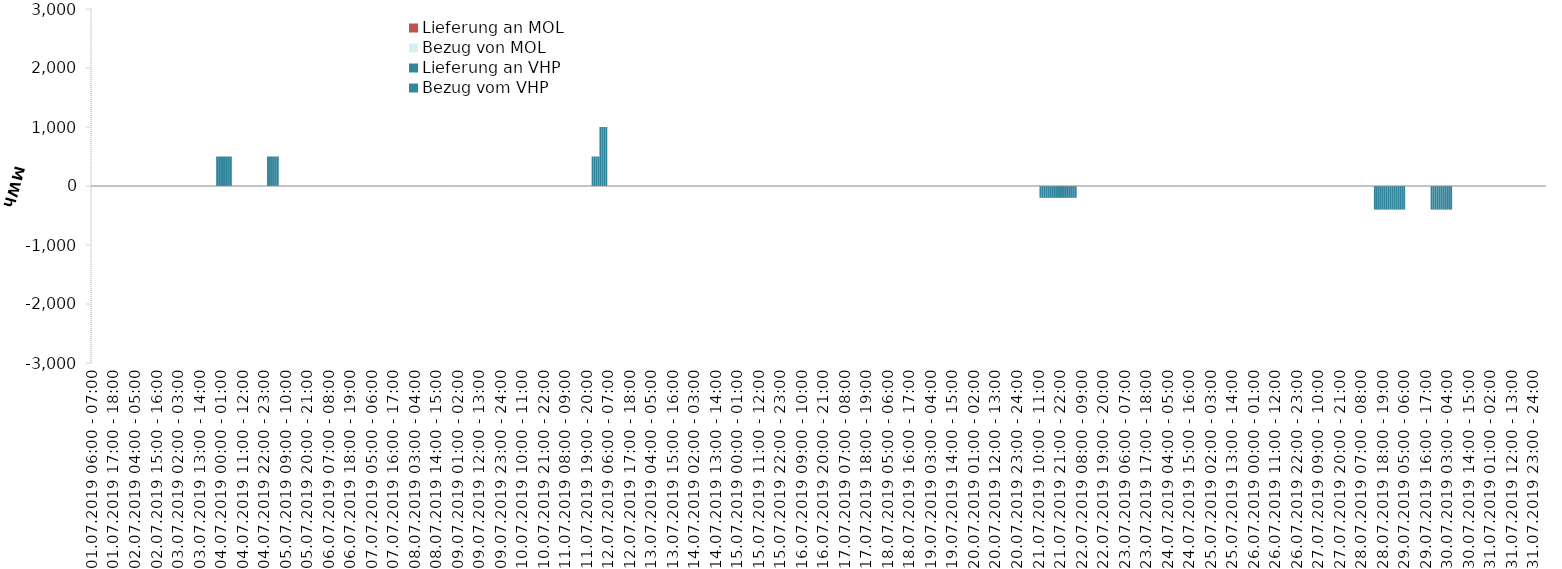
| Category | Bezug vom VHP | Lieferung an VHP | Bezug von MOL | Lieferung an MOL |
|---|---|---|---|---|
| 01.07.2019 06:00 - 07:00 | 0 | 0 | 0 | 0 |
| 01.07.2019 07:00 - 08:00 | 0 | 0 | 0 | 0 |
| 01.07.2019 08:00 - 09:00 | 0 | 0 | 0 | 0 |
| 01.07.2019 09:00 - 10:00 | 0 | 0 | 0 | 0 |
| 01.07.2019 10:00 - 11:00 | 0 | 0 | 0 | 0 |
| 01.07.2019 11:00 - 12:00 | 0 | 0 | 0 | 0 |
| 01.07.2019 12:00 - 13:00 | 0 | 0 | 0 | 0 |
| 01.07.2019 13:00 - 14:00 | 0 | 0 | 0 | 0 |
| 01.07.2019 14:00 - 15:00 | 0 | 0 | 0 | 0 |
| 01.07.2019 15:00 - 16:00 | 0 | 0 | 0 | 0 |
| 01.07.2019 16:00 - 17:00 | 0 | 0 | 0 | 0 |
| 01.07.2019 17:00 - 18:00 | 0 | 0 | 0 | 0 |
| 01.07.2019 18:00 - 19:00 | 0 | 0 | 0 | 0 |
| 01.07.2019 19:00 - 20:00 | 0 | 0 | 0 | 0 |
| 01.07.2019 20:00 - 21:00 | 0 | 0 | 0 | 0 |
| 01.07.2019 21:00 - 22:00 | 0 | 0 | 0 | 0 |
| 01.07.2019 22:00 - 23:00 | 0 | 0 | 0 | 0 |
| 01.07.2019 23:00 - 24:00 | 0 | 0 | 0 | 0 |
| 02.07.2019 00:00 - 01:00 | 0 | 0 | 0 | 0 |
| 02.07.2019 01:00 - 02:00 | 0 | 0 | 0 | 0 |
| 02.07.2019 02:00 - 03:00 | 0 | 0 | 0 | 0 |
| 02.07.2019 03:00 - 04:00 | 0 | 0 | 0 | 0 |
| 02.07.2019 04:00 - 05:00 | 0 | 0 | 0 | 0 |
| 02.07.2019 05:00 - 06:00 | 0 | 0 | 0 | 0 |
| 02.07.2019 06:00 - 07:00 | 0 | 0 | 0 | 0 |
| 02.07.2019 07:00 - 08:00 | 0 | 0 | 0 | 0 |
| 02.07.2019 08:00 - 09:00 | 0 | 0 | 0 | 0 |
| 02.07.2019 09:00 - 10:00 | 0 | 0 | 0 | 0 |
| 02.07.2019 10:00 - 11:00 | 0 | 0 | 0 | 0 |
| 02.07.2019 11:00 - 12:00 | 0 | 0 | 0 | 0 |
| 02.07.2019 12:00 - 13:00 | 0 | 0 | 0 | 0 |
| 02.07.2019 13:00 - 14:00 | 0 | 0 | 0 | 0 |
| 02.07.2019 14:00 - 15:00 | 0 | 0 | 0 | 0 |
| 02.07.2019 15:00 - 16:00 | 0 | 0 | 0 | 0 |
| 02.07.2019 16:00 - 17:00 | 0 | 0 | 0 | 0 |
| 02.07.2019 17:00 - 18:00 | 0 | 0 | 0 | 0 |
| 02.07.2019 18:00 - 19:00 | 0 | 0 | 0 | 0 |
| 02.07.2019 19:00 - 20:00 | 0 | 0 | 0 | 0 |
| 02.07.2019 20:00 - 21:00 | 0 | 0 | 0 | 0 |
| 02.07.2019 21:00 - 22:00 | 0 | 0 | 0 | 0 |
| 02.07.2019 22:00 - 23:00 | 0 | 0 | 0 | 0 |
| 02.07.2019 23:00 - 24:00 | 0 | 0 | 0 | 0 |
| 03.07.2019 00:00 - 01:00 | 0 | 0 | 0 | 0 |
| 03.07.2019 01:00 - 02:00 | 0 | 0 | 0 | 0 |
| 03.07.2019 02:00 - 03:00 | 0 | 0 | 0 | 0 |
| 03.07.2019 03:00 - 04:00 | 0 | 0 | 0 | 0 |
| 03.07.2019 04:00 - 05:00 | 0 | 0 | 0 | 0 |
| 03.07.2019 05:00 - 06:00 | 0 | 0 | 0 | 0 |
| 03.07.2019 06:00 - 07:00 | 0 | 0 | 0 | 0 |
| 03.07.2019 07:00 - 08:00 | 0 | 0 | 0 | 0 |
| 03.07.2019 08:00 - 09:00 | 0 | 0 | 0 | 0 |
| 03.07.2019 09:00 - 10:00 | 0 | 0 | 0 | 0 |
| 03.07.2019 10:00 - 11:00 | 0 | 0 | 0 | 0 |
| 03.07.2019 11:00 - 12:00 | 0 | 0 | 0 | 0 |
| 03.07.2019 12:00 - 13:00 | 0 | 0 | 0 | 0 |
| 03.07.2019 13:00 - 14:00 | 0 | 0 | 0 | 0 |
| 03.07.2019 14:00 - 15:00 | 0 | 0 | 0 | 0 |
| 03.07.2019 15:00 - 16:00 | 0 | 0 | 0 | 0 |
| 03.07.2019 16:00 - 17:00 | 0 | 0 | 0 | 0 |
| 03.07.2019 17:00 - 18:00 | 0 | 0 | 0 | 0 |
| 03.07.2019 18:00 - 19:00 | 0 | 0 | 0 | 0 |
| 03.07.2019 19:00 - 20:00 | 0 | 0 | 0 | 0 |
| 03.07.2019 20:00 - 21:00 | 0 | 0 | 0 | 0 |
| 03.07.2019 21:00 - 22:00 | 0 | 0 | 0 | 0 |
| 03.07.2019 22:00 - 23:00 | 500 | 0 | 0 | 0 |
| 03.07.2019 23:00 - 24:00 | 500 | 0 | 0 | 0 |
| 04.07.2019 00:00 - 01:00 | 500 | 0 | 0 | 0 |
| 04.07.2019 01:00 - 02:00 | 500 | 0 | 0 | 0 |
| 04.07.2019 02:00 - 03:00 | 500 | 0 | 0 | 0 |
| 04.07.2019 03:00 - 04:00 | 500 | 0 | 0 | 0 |
| 04.07.2019 04:00 - 05:00 | 500 | 0 | 0 | 0 |
| 04.07.2019 05:00 - 06:00 | 500 | 0 | 0 | 0 |
| 04.07.2019 06:00 - 07:00 | 0 | 0 | 0 | 0 |
| 04.07.2019 07:00 - 08:00 | 0 | 0 | 0 | 0 |
| 04.07.2019 08:00 - 09:00 | 0 | 0 | 0 | 0 |
| 04.07.2019 09:00 - 10:00 | 0 | 0 | 0 | 0 |
| 04.07.2019 10:00 - 11:00 | 0 | 0 | 0 | 0 |
| 04.07.2019 11:00 - 12:00 | 0 | 0 | 0 | 0 |
| 04.07.2019 12:00 - 13:00 | 0 | 0 | 0 | 0 |
| 04.07.2019 13:00 - 14:00 | 0 | 0 | 0 | 0 |
| 04.07.2019 14:00 - 15:00 | 0 | 0 | 0 | 0 |
| 04.07.2019 15:00 - 16:00 | 0 | 0 | 0 | 0 |
| 04.07.2019 16:00 - 17:00 | 0 | 0 | 0 | 0 |
| 04.07.2019 17:00 - 18:00 | 0 | 0 | 0 | 0 |
| 04.07.2019 18:00 - 19:00 | 0 | 0 | 0 | 0 |
| 04.07.2019 19:00 - 20:00 | 0 | 0 | 0 | 0 |
| 04.07.2019 20:00 - 21:00 | 0 | 0 | 0 | 0 |
| 04.07.2019 21:00 - 22:00 | 0 | 0 | 0 | 0 |
| 04.07.2019 22:00 - 23:00 | 0 | 0 | 0 | 0 |
| 04.07.2019 23:00 - 24:00 | 0 | 0 | 0 | 0 |
| 05.07.2019 00:00 - 01:00 | 500 | 0 | 0 | 0 |
| 05.07.2019 01:00 - 02:00 | 500 | 0 | 0 | 0 |
| 05.07.2019 02:00 - 03:00 | 500 | 0 | 0 | 0 |
| 05.07.2019 03:00 - 04:00 | 500 | 0 | 0 | 0 |
| 05.07.2019 04:00 - 05:00 | 500 | 0 | 0 | 0 |
| 05.07.2019 05:00 - 06:00 | 500 | 0 | 0 | 0 |
| 05.07.2019 06:00 - 07:00 | 0 | 0 | 0 | 0 |
| 05.07.2019 07:00 - 08:00 | 0 | 0 | 0 | 0 |
| 05.07.2019 08:00 - 09:00 | 0 | 0 | 0 | 0 |
| 05.07.2019 09:00 - 10:00 | 0 | 0 | 0 | 0 |
| 05.07.2019 10:00 - 11:00 | 0 | 0 | 0 | 0 |
| 05.07.2019 11:00 - 12:00 | 0 | 0 | 0 | 0 |
| 05.07.2019 12:00 - 13:00 | 0 | 0 | 0 | 0 |
| 05.07.2019 13:00 - 14:00 | 0 | 0 | 0 | 0 |
| 05.07.2019 14:00 - 15:00 | 0 | 0 | 0 | 0 |
| 05.07.2019 15:00 - 16:00 | 0 | 0 | 0 | 0 |
| 05.07.2019 16:00 - 17:00 | 0 | 0 | 0 | 0 |
| 05.07.2019 17:00 - 18:00 | 0 | 0 | 0 | 0 |
| 05.07.2019 18:00 - 19:00 | 0 | 0 | 0 | 0 |
| 05.07.2019 19:00 - 20:00 | 0 | 0 | 0 | 0 |
| 05.07.2019 20:00 - 21:00 | 0 | 0 | 0 | 0 |
| 05.07.2019 21:00 - 22:00 | 0 | 0 | 0 | 0 |
| 05.07.2019 22:00 - 23:00 | 0 | 0 | 0 | 0 |
| 05.07.2019 23:00 - 24:00 | 0 | 0 | 0 | 0 |
| 06.07.2019 00:00 - 01:00 | 0 | 0 | 0 | 0 |
| 06.07.2019 01:00 - 02:00 | 0 | 0 | 0 | 0 |
| 06.07.2019 02:00 - 03:00 | 0 | 0 | 0 | 0 |
| 06.07.2019 03:00 - 04:00 | 0 | 0 | 0 | 0 |
| 06.07.2019 04:00 - 05:00 | 0 | 0 | 0 | 0 |
| 06.07.2019 05:00 - 06:00 | 0 | 0 | 0 | 0 |
| 06.07.2019 06:00 - 07:00 | 0 | 0 | 0 | 0 |
| 06.07.2019 07:00 - 08:00 | 0 | 0 | 0 | 0 |
| 06.07.2019 08:00 - 09:00 | 0 | 0 | 0 | 0 |
| 06.07.2019 09:00 - 10:00 | 0 | 0 | 0 | 0 |
| 06.07.2019 10:00 - 11:00 | 0 | 0 | 0 | 0 |
| 06.07.2019 11:00 - 12:00 | 0 | 0 | 0 | 0 |
| 06.07.2019 12:00 - 13:00 | 0 | 0 | 0 | 0 |
| 06.07.2019 13:00 - 14:00 | 0 | 0 | 0 | 0 |
| 06.07.2019 14:00 - 15:00 | 0 | 0 | 0 | 0 |
| 06.07.2019 15:00 - 16:00 | 0 | 0 | 0 | 0 |
| 06.07.2019 16:00 - 17:00 | 0 | 0 | 0 | 0 |
| 06.07.2019 17:00 - 18:00 | 0 | 0 | 0 | 0 |
| 06.07.2019 18:00 - 19:00 | 0 | 0 | 0 | 0 |
| 06.07.2019 19:00 - 20:00 | 0 | 0 | 0 | 0 |
| 06.07.2019 20:00 - 21:00 | 0 | 0 | 0 | 0 |
| 06.07.2019 21:00 - 22:00 | 0 | 0 | 0 | 0 |
| 06.07.2019 22:00 - 23:00 | 0 | 0 | 0 | 0 |
| 06.07.2019 23:00 - 24:00 | 0 | 0 | 0 | 0 |
| 07.07.2019 00:00 - 01:00 | 0 | 0 | 0 | 0 |
| 07.07.2019 01:00 - 02:00 | 0 | 0 | 0 | 0 |
| 07.07.2019 02:00 - 03:00 | 0 | 0 | 0 | 0 |
| 07.07.2019 03:00 - 04:00 | 0 | 0 | 0 | 0 |
| 07.07.2019 04:00 - 05:00 | 0 | 0 | 0 | 0 |
| 07.07.2019 05:00 - 06:00 | 0 | 0 | 0 | 0 |
| 07.07.2019 06:00 - 07:00 | 0 | 0 | 0 | 0 |
| 07.07.2019 07:00 - 08:00 | 0 | 0 | 0 | 0 |
| 07.07.2019 08:00 - 09:00 | 0 | 0 | 0 | 0 |
| 07.07.2019 09:00 - 10:00 | 0 | 0 | 0 | 0 |
| 07.07.2019 10:00 - 11:00 | 0 | 0 | 0 | 0 |
| 07.07.2019 11:00 - 12:00 | 0 | 0 | 0 | 0 |
| 07.07.2019 12:00 - 13:00 | 0 | 0 | 0 | 0 |
| 07.07.2019 13:00 - 14:00 | 0 | 0 | 0 | 0 |
| 07.07.2019 14:00 - 15:00 | 0 | 0 | 0 | 0 |
| 07.07.2019 15:00 - 16:00 | 0 | 0 | 0 | 0 |
| 07.07.2019 16:00 - 17:00 | 0 | 0 | 0 | 0 |
| 07.07.2019 17:00 - 18:00 | 0 | 0 | 0 | 0 |
| 07.07.2019 18:00 - 19:00 | 0 | 0 | 0 | 0 |
| 07.07.2019 19:00 - 20:00 | 0 | 0 | 0 | 0 |
| 07.07.2019 20:00 - 21:00 | 0 | 0 | 0 | 0 |
| 07.07.2019 21:00 - 22:00 | 0 | 0 | 0 | 0 |
| 07.07.2019 22:00 - 23:00 | 0 | 0 | 0 | 0 |
| 07.07.2019 23:00 - 24:00 | 0 | 0 | 0 | 0 |
| 08.07.2019 00:00 - 01:00 | 0 | 0 | 0 | 0 |
| 08.07.2019 01:00 - 02:00 | 0 | 0 | 0 | 0 |
| 08.07.2019 02:00 - 03:00 | 0 | 0 | 0 | 0 |
| 08.07.2019 03:00 - 04:00 | 0 | 0 | 0 | 0 |
| 08.07.2019 04:00 - 05:00 | 0 | 0 | 0 | 0 |
| 08.07.2019 05:00 - 06:00 | 0 | 0 | 0 | 0 |
| 08.07.2019 06:00 - 07:00 | 0 | 0 | 0 | 0 |
| 08.07.2019 07:00 - 08:00 | 0 | 0 | 0 | 0 |
| 08.07.2019 08:00 - 09:00 | 0 | 0 | 0 | 0 |
| 08.07.2019 09:00 - 10:00 | 0 | 0 | 0 | 0 |
| 08.07.2019 10:00 - 11:00 | 0 | 0 | 0 | 0 |
| 08.07.2019 11:00 - 12:00 | 0 | 0 | 0 | 0 |
| 08.07.2019 12:00 - 13:00 | 0 | 0 | 0 | 0 |
| 08.07.2019 13:00 - 14:00 | 0 | 0 | 0 | 0 |
| 08.07.2019 14:00 - 15:00 | 0 | 0 | 0 | 0 |
| 08.07.2019 15:00 - 16:00 | 0 | 0 | 0 | 0 |
| 08.07.2019 16:00 - 17:00 | 0 | 0 | 0 | 0 |
| 08.07.2019 17:00 - 18:00 | 0 | 0 | 0 | 0 |
| 08.07.2019 18:00 - 19:00 | 0 | 0 | 0 | 0 |
| 08.07.2019 19:00 - 20:00 | 0 | 0 | 0 | 0 |
| 08.07.2019 20:00 - 21:00 | 0 | 0 | 0 | 0 |
| 08.07.2019 21:00 - 22:00 | 0 | 0 | 0 | 0 |
| 08.07.2019 22:00 - 23:00 | 0 | 0 | 0 | 0 |
| 08.07.2019 23:00 - 24:00 | 0 | 0 | 0 | 0 |
| 09.07.2019 00:00 - 01:00 | 0 | 0 | 0 | 0 |
| 09.07.2019 01:00 - 02:00 | 0 | 0 | 0 | 0 |
| 09.07.2019 02:00 - 03:00 | 0 | 0 | 0 | 0 |
| 09.07.2019 03:00 - 04:00 | 0 | 0 | 0 | 0 |
| 09.07.2019 04:00 - 05:00 | 0 | 0 | 0 | 0 |
| 09.07.2019 05:00 - 06:00 | 0 | 0 | 0 | 0 |
| 09.07.2019 06:00 - 07:00 | 0 | 0 | 0 | 0 |
| 09.07.2019 07:00 - 08:00 | 0 | 0 | 0 | 0 |
| 09.07.2019 08:00 - 09:00 | 0 | 0 | 0 | 0 |
| 09.07.2019 09:00 - 10:00 | 0 | 0 | 0 | 0 |
| 09.07.2019 10:00 - 11:00 | 0 | 0 | 0 | 0 |
| 09.07.2019 11:00 - 12:00 | 0 | 0 | 0 | 0 |
| 09.07.2019 12:00 - 13:00 | 0 | 0 | 0 | 0 |
| 09.07.2019 13:00 - 14:00 | 0 | 0 | 0 | 0 |
| 09.07.2019 14:00 - 15:00 | 0 | 0 | 0 | 0 |
| 09.07.2019 15:00 - 16:00 | 0 | 0 | 0 | 0 |
| 09.07.2019 16:00 - 17:00 | 0 | 0 | 0 | 0 |
| 09.07.2019 17:00 - 18:00 | 0 | 0 | 0 | 0 |
| 09.07.2019 18:00 - 19:00 | 0 | 0 | 0 | 0 |
| 09.07.2019 19:00 - 20:00 | 0 | 0 | 0 | 0 |
| 09.07.2019 20:00 - 21:00 | 0 | 0 | 0 | 0 |
| 09.07.2019 21:00 - 22:00 | 0 | 0 | 0 | 0 |
| 09.07.2019 22:00 - 23:00 | 0 | 0 | 0 | 0 |
| 09.07.2019 23:00 - 24:00 | 0 | 0 | 0 | 0 |
| 10.07.2019 00:00 - 01:00 | 0 | 0 | 0 | 0 |
| 10.07.2019 01:00 - 02:00 | 0 | 0 | 0 | 0 |
| 10.07.2019 02:00 - 03:00 | 0 | 0 | 0 | 0 |
| 10.07.2019 03:00 - 04:00 | 0 | 0 | 0 | 0 |
| 10.07.2019 04:00 - 05:00 | 0 | 0 | 0 | 0 |
| 10.07.2019 05:00 - 06:00 | 0 | 0 | 0 | 0 |
| 10.07.2019 06:00 - 07:00 | 0 | 0 | 0 | 0 |
| 10.07.2019 07:00 - 08:00 | 0 | 0 | 0 | 0 |
| 10.07.2019 08:00 - 09:00 | 0 | 0 | 0 | 0 |
| 10.07.2019 09:00 - 10:00 | 0 | 0 | 0 | 0 |
| 10.07.2019 10:00 - 11:00 | 0 | 0 | 0 | 0 |
| 10.07.2019 11:00 - 12:00 | 0 | 0 | 0 | 0 |
| 10.07.2019 12:00 - 13:00 | 0 | 0 | 0 | 0 |
| 10.07.2019 13:00 - 14:00 | 0 | 0 | 0 | 0 |
| 10.07.2019 14:00 - 15:00 | 0 | 0 | 0 | 0 |
| 10.07.2019 15:00 - 16:00 | 0 | 0 | 0 | 0 |
| 10.07.2019 16:00 - 17:00 | 0 | 0 | 0 | 0 |
| 10.07.2019 17:00 - 18:00 | 0 | 0 | 0 | 0 |
| 10.07.2019 18:00 - 19:00 | 0 | 0 | 0 | 0 |
| 10.07.2019 19:00 - 20:00 | 0 | 0 | 0 | 0 |
| 10.07.2019 20:00 - 21:00 | 0 | 0 | 0 | 0 |
| 10.07.2019 21:00 - 22:00 | 0 | 0 | 0 | 0 |
| 10.07.2019 22:00 - 23:00 | 0 | 0 | 0 | 0 |
| 10.07.2019 23:00 - 24:00 | 0 | 0 | 0 | 0 |
| 11.07.2019 00:00 - 01:00 | 0 | 0 | 0 | 0 |
| 11.07.2019 01:00 - 02:00 | 0 | 0 | 0 | 0 |
| 11.07.2019 02:00 - 03:00 | 0 | 0 | 0 | 0 |
| 11.07.2019 03:00 - 04:00 | 0 | 0 | 0 | 0 |
| 11.07.2019 04:00 - 05:00 | 0 | 0 | 0 | 0 |
| 11.07.2019 05:00 - 06:00 | 0 | 0 | 0 | 0 |
| 11.07.2019 06:00 - 07:00 | 0 | 0 | 0 | 0 |
| 11.07.2019 07:00 - 08:00 | 0 | 0 | 0 | 0 |
| 11.07.2019 08:00 - 09:00 | 0 | 0 | 0 | 0 |
| 11.07.2019 09:00 - 10:00 | 0 | 0 | 0 | 0 |
| 11.07.2019 10:00 - 11:00 | 0 | 0 | 0 | 0 |
| 11.07.2019 11:00 - 12:00 | 0 | 0 | 0 | 0 |
| 11.07.2019 12:00 - 13:00 | 0 | 0 | 0 | 0 |
| 11.07.2019 13:00 - 14:00 | 0 | 0 | 0 | 0 |
| 11.07.2019 14:00 - 15:00 | 0 | 0 | 0 | 0 |
| 11.07.2019 15:00 - 16:00 | 0 | 0 | 0 | 0 |
| 11.07.2019 16:00 - 17:00 | 0 | 0 | 0 | 0 |
| 11.07.2019 17:00 - 18:00 | 0 | 0 | 0 | 0 |
| 11.07.2019 18:00 - 19:00 | 0 | 0 | 0 | 0 |
| 11.07.2019 19:00 - 20:00 | 0 | 0 | 0 | 0 |
| 11.07.2019 20:00 - 21:00 | 0 | 0 | 0 | 0 |
| 11.07.2019 21:00 - 22:00 | 0 | 0 | 0 | 0 |
| 11.07.2019 22:00 - 23:00 | 500 | 0 | 0 | 0 |
| 11.07.2019 23:00 - 24:00 | 500 | 0 | 0 | 0 |
| 12.07.2019 00:00 - 01:00 | 500 | 0 | 0 | 0 |
| 12.07.2019 01:00 - 02:00 | 500 | 0 | 0 | 0 |
| 12.07.2019 02:00 - 03:00 | 1000 | 0 | 0 | 0 |
| 12.07.2019 03:00 - 04:00 | 1000 | 0 | 0 | 0 |
| 12.07.2019 04:00 - 05:00 | 1000 | 0 | 0 | 0 |
| 12.07.2019 05:00 - 06:00 | 1000 | 0 | 0 | 0 |
| 12.07.2019 06:00 - 07:00 | 0 | 0 | 0 | 0 |
| 12.07.2019 07:00 - 08:00 | 0 | 0 | 0 | 0 |
| 12.07.2019 08:00 - 09:00 | 0 | 0 | 0 | 0 |
| 12.07.2019 09:00 - 10:00 | 0 | 0 | 0 | 0 |
| 12.07.2019 10:00 - 11:00 | 0 | 0 | 0 | 0 |
| 12.07.2019 11:00 - 12:00 | 0 | 0 | 0 | 0 |
| 12.07.2019 12:00 - 13:00 | 0 | 0 | 0 | 0 |
| 12.07.2019 13:00 - 14:00 | 0 | 0 | 0 | 0 |
| 12.07.2019 14:00 - 15:00 | 0 | 0 | 0 | 0 |
| 12.07.2019 15:00 - 16:00 | 0 | 0 | 0 | 0 |
| 12.07.2019 16:00 - 17:00 | 0 | 0 | 0 | 0 |
| 12.07.2019 17:00 - 18:00 | 0 | 0 | 0 | 0 |
| 12.07.2019 18:00 - 19:00 | 0 | 0 | 0 | 0 |
| 12.07.2019 19:00 - 20:00 | 0 | 0 | 0 | 0 |
| 12.07.2019 20:00 - 21:00 | 0 | 0 | 0 | 0 |
| 12.07.2019 21:00 - 22:00 | 0 | 0 | 0 | 0 |
| 12.07.2019 22:00 - 23:00 | 0 | 0 | 0 | 0 |
| 12.07.2019 23:00 - 24:00 | 0 | 0 | 0 | 0 |
| 13.07.2019 00:00 - 01:00 | 0 | 0 | 0 | 0 |
| 13.07.2019 01:00 - 02:00 | 0 | 0 | 0 | 0 |
| 13.07.2019 02:00 - 03:00 | 0 | 0 | 0 | 0 |
| 13.07.2019 03:00 - 04:00 | 0 | 0 | 0 | 0 |
| 13.07.2019 04:00 - 05:00 | 0 | 0 | 0 | 0 |
| 13.07.2019 05:00 - 06:00 | 0 | 0 | 0 | 0 |
| 13.07.2019 06:00 - 07:00 | 0 | 0 | 0 | 0 |
| 13.07.2019 07:00 - 08:00 | 0 | 0 | 0 | 0 |
| 13.07.2019 08:00 - 09:00 | 0 | 0 | 0 | 0 |
| 13.07.2019 09:00 - 10:00 | 0 | 0 | 0 | 0 |
| 13.07.2019 10:00 - 11:00 | 0 | 0 | 0 | 0 |
| 13.07.2019 11:00 - 12:00 | 0 | 0 | 0 | 0 |
| 13.07.2019 12:00 - 13:00 | 0 | 0 | 0 | 0 |
| 13.07.2019 13:00 - 14:00 | 0 | 0 | 0 | 0 |
| 13.07.2019 14:00 - 15:00 | 0 | 0 | 0 | 0 |
| 13.07.2019 15:00 - 16:00 | 0 | 0 | 0 | 0 |
| 13.07.2019 16:00 - 17:00 | 0 | 0 | 0 | 0 |
| 13.07.2019 17:00 - 18:00 | 0 | 0 | 0 | 0 |
| 13.07.2019 18:00 - 19:00 | 0 | 0 | 0 | 0 |
| 13.07.2019 19:00 - 20:00 | 0 | 0 | 0 | 0 |
| 13.07.2019 20:00 - 21:00 | 0 | 0 | 0 | 0 |
| 13.07.2019 21:00 - 22:00 | 0 | 0 | 0 | 0 |
| 13.07.2019 22:00 - 23:00 | 0 | 0 | 0 | 0 |
| 13.07.2019 23:00 - 24:00 | 0 | 0 | 0 | 0 |
| 14.07.2019 00:00 - 01:00 | 0 | 0 | 0 | 0 |
| 14.07.2019 01:00 - 02:00 | 0 | 0 | 0 | 0 |
| 14.07.2019 02:00 - 03:00 | 0 | 0 | 0 | 0 |
| 14.07.2019 03:00 - 04:00 | 0 | 0 | 0 | 0 |
| 14.07.2019 04:00 - 05:00 | 0 | 0 | 0 | 0 |
| 14.07.2019 05:00 - 06:00 | 0 | 0 | 0 | 0 |
| 14.07.2019 06:00 - 07:00 | 0 | 0 | 0 | 0 |
| 14.07.2019 07:00 - 08:00 | 0 | 0 | 0 | 0 |
| 14.07.2019 08:00 - 09:00 | 0 | 0 | 0 | 0 |
| 14.07.2019 09:00 - 10:00 | 0 | 0 | 0 | 0 |
| 14.07.2019 10:00 - 11:00 | 0 | 0 | 0 | 0 |
| 14.07.2019 11:00 - 12:00 | 0 | 0 | 0 | 0 |
| 14.07.2019 12:00 - 13:00 | 0 | 0 | 0 | 0 |
| 14.07.2019 13:00 - 14:00 | 0 | 0 | 0 | 0 |
| 14.07.2019 14:00 - 15:00 | 0 | 0 | 0 | 0 |
| 14.07.2019 15:00 - 16:00 | 0 | 0 | 0 | 0 |
| 14.07.2019 16:00 - 17:00 | 0 | 0 | 0 | 0 |
| 14.07.2019 17:00 - 18:00 | 0 | 0 | 0 | 0 |
| 14.07.2019 18:00 - 19:00 | 0 | 0 | 0 | 0 |
| 14.07.2019 19:00 - 20:00 | 0 | 0 | 0 | 0 |
| 14.07.2019 20:00 - 21:00 | 0 | 0 | 0 | 0 |
| 14.07.2019 21:00 - 22:00 | 0 | 0 | 0 | 0 |
| 14.07.2019 22:00 - 23:00 | 0 | 0 | 0 | 0 |
| 14.07.2019 23:00 - 24:00 | 0 | 0 | 0 | 0 |
| 15.07.2019 00:00 - 01:00 | 0 | 0 | 0 | 0 |
| 15.07.2019 01:00 - 02:00 | 0 | 0 | 0 | 0 |
| 15.07.2019 02:00 - 03:00 | 0 | 0 | 0 | 0 |
| 15.07.2019 03:00 - 04:00 | 0 | 0 | 0 | 0 |
| 15.07.2019 04:00 - 05:00 | 0 | 0 | 0 | 0 |
| 15.07.2019 05:00 - 06:00 | 0 | 0 | 0 | 0 |
| 15.07.2019 06:00 - 07:00 | 0 | 0 | 0 | 0 |
| 15.07.2019 07:00 - 08:00 | 0 | 0 | 0 | 0 |
| 15.07.2019 08:00 - 09:00 | 0 | 0 | 0 | 0 |
| 15.07.2019 09:00 - 10:00 | 0 | 0 | 0 | 0 |
| 15.07.2019 10:00 - 11:00 | 0 | 0 | 0 | 0 |
| 15.07.2019 11:00 - 12:00 | 0 | 0 | 0 | 0 |
| 15.07.2019 12:00 - 13:00 | 0 | 0 | 0 | 0 |
| 15.07.2019 13:00 - 14:00 | 0 | 0 | 0 | 0 |
| 15.07.2019 14:00 - 15:00 | 0 | 0 | 0 | 0 |
| 15.07.2019 15:00 - 16:00 | 0 | 0 | 0 | 0 |
| 15.07.2019 16:00 - 17:00 | 0 | 0 | 0 | 0 |
| 15.07.2019 17:00 - 18:00 | 0 | 0 | 0 | 0 |
| 15.07.2019 18:00 - 19:00 | 0 | 0 | 0 | 0 |
| 15.07.2019 19:00 - 20:00 | 0 | 0 | 0 | 0 |
| 15.07.2019 20:00 - 21:00 | 0 | 0 | 0 | 0 |
| 15.07.2019 21:00 - 22:00 | 0 | 0 | 0 | 0 |
| 15.07.2019 22:00 - 23:00 | 0 | 0 | 0 | 0 |
| 15.07.2019 23:00 - 24:00 | 0 | 0 | 0 | 0 |
| 16.07.2019 00:00 - 01:00 | 0 | 0 | 0 | 0 |
| 16.07.2019 01:00 - 02:00 | 0 | 0 | 0 | 0 |
| 16.07.2019 02:00 - 03:00 | 0 | 0 | 0 | 0 |
| 16.07.2019 03:00 - 04:00 | 0 | 0 | 0 | 0 |
| 16.07.2019 04:00 - 05:00 | 0 | 0 | 0 | 0 |
| 16.07.2019 05:00 - 06:00 | 0 | 0 | 0 | 0 |
| 16.07.2019 06:00 - 07:00 | 0 | 0 | 0 | 0 |
| 16.07.2019 07:00 - 08:00 | 0 | 0 | 0 | 0 |
| 16.07.2019 08:00 - 09:00 | 0 | 0 | 0 | 0 |
| 16.07.2019 09:00 - 10:00 | 0 | 0 | 0 | 0 |
| 16.07.2019 10:00 - 11:00 | 0 | 0 | 0 | 0 |
| 16.07.2019 11:00 - 12:00 | 0 | 0 | 0 | 0 |
| 16.07.2019 12:00 - 13:00 | 0 | 0 | 0 | 0 |
| 16.07.2019 13:00 - 14:00 | 0 | 0 | 0 | 0 |
| 16.07.2019 14:00 - 15:00 | 0 | 0 | 0 | 0 |
| 16.07.2019 15:00 - 16:00 | 0 | 0 | 0 | 0 |
| 16.07.2019 16:00 - 17:00 | 0 | 0 | 0 | 0 |
| 16.07.2019 17:00 - 18:00 | 0 | 0 | 0 | 0 |
| 16.07.2019 18:00 - 19:00 | 0 | 0 | 0 | 0 |
| 16.07.2019 19:00 - 20:00 | 0 | 0 | 0 | 0 |
| 16.07.2019 20:00 - 21:00 | 0 | 0 | 0 | 0 |
| 16.07.2019 21:00 - 22:00 | 0 | 0 | 0 | 0 |
| 16.07.2019 22:00 - 23:00 | 0 | 0 | 0 | 0 |
| 16.07.2019 23:00 - 24:00 | 0 | 0 | 0 | 0 |
| 17.07.2019 00:00 - 01:00 | 0 | 0 | 0 | 0 |
| 17.07.2019 01:00 - 02:00 | 0 | 0 | 0 | 0 |
| 17.07.2019 02:00 - 03:00 | 0 | 0 | 0 | 0 |
| 17.07.2019 03:00 - 04:00 | 0 | 0 | 0 | 0 |
| 17.07.2019 04:00 - 05:00 | 0 | 0 | 0 | 0 |
| 17.07.2019 05:00 - 06:00 | 0 | 0 | 0 | 0 |
| 17.07.2019 06:00 - 07:00 | 0 | 0 | 0 | 0 |
| 17.07.2019 07:00 - 08:00 | 0 | 0 | 0 | 0 |
| 17.07.2019 08:00 - 09:00 | 0 | 0 | 0 | 0 |
| 17.07.2019 09:00 - 10:00 | 0 | 0 | 0 | 0 |
| 17.07.2019 10:00 - 11:00 | 0 | 0 | 0 | 0 |
| 17.07.2019 11:00 - 12:00 | 0 | 0 | 0 | 0 |
| 17.07.2019 12:00 - 13:00 | 0 | 0 | 0 | 0 |
| 17.07.2019 13:00 - 14:00 | 0 | 0 | 0 | 0 |
| 17.07.2019 14:00 - 15:00 | 0 | 0 | 0 | 0 |
| 17.07.2019 15:00 - 16:00 | 0 | 0 | 0 | 0 |
| 17.07.2019 16:00 - 17:00 | 0 | 0 | 0 | 0 |
| 17.07.2019 17:00 - 18:00 | 0 | 0 | 0 | 0 |
| 17.07.2019 18:00 - 19:00 | 0 | 0 | 0 | 0 |
| 17.07.2019 19:00 - 20:00 | 0 | 0 | 0 | 0 |
| 17.07.2019 20:00 - 21:00 | 0 | 0 | 0 | 0 |
| 17.07.2019 21:00 - 22:00 | 0 | 0 | 0 | 0 |
| 17.07.2019 22:00 - 23:00 | 0 | 0 | 0 | 0 |
| 17.07.2019 23:00 - 24:00 | 0 | 0 | 0 | 0 |
| 18.07.2019 00:00 - 01:00 | 0 | 0 | 0 | 0 |
| 18.07.2019 01:00 - 02:00 | 0 | 0 | 0 | 0 |
| 18.07.2019 02:00 - 03:00 | 0 | 0 | 0 | 0 |
| 18.07.2019 03:00 - 04:00 | 0 | 0 | 0 | 0 |
| 18.07.2019 04:00 - 05:00 | 0 | 0 | 0 | 0 |
| 18.07.2019 05:00 - 06:00 | 0 | 0 | 0 | 0 |
| 18.07.2019 06:00 - 07:00 | 0 | 0 | 0 | 0 |
| 18.07.2019 07:00 - 08:00 | 0 | 0 | 0 | 0 |
| 18.07.2019 08:00 - 09:00 | 0 | 0 | 0 | 0 |
| 18.07.2019 09:00 - 10:00 | 0 | 0 | 0 | 0 |
| 18.07.2019 10:00 - 11:00 | 0 | 0 | 0 | 0 |
| 18.07.2019 11:00 - 12:00 | 0 | 0 | 0 | 0 |
| 18.07.2019 12:00 - 13:00 | 0 | 0 | 0 | 0 |
| 18.07.2019 13:00 - 14:00 | 0 | 0 | 0 | 0 |
| 18.07.2019 14:00 - 15:00 | 0 | 0 | 0 | 0 |
| 18.07.2019 15:00 - 16:00 | 0 | 0 | 0 | 0 |
| 18.07.2019 16:00 - 17:00 | 0 | 0 | 0 | 0 |
| 18.07.2019 17:00 - 18:00 | 0 | 0 | 0 | 0 |
| 18.07.2019 18:00 - 19:00 | 0 | 0 | 0 | 0 |
| 18.07.2019 19:00 - 20:00 | 0 | 0 | 0 | 0 |
| 18.07.2019 20:00 - 21:00 | 0 | 0 | 0 | 0 |
| 18.07.2019 21:00 - 22:00 | 0 | 0 | 0 | 0 |
| 18.07.2019 22:00 - 23:00 | 0 | 0 | 0 | 0 |
| 18.07.2019 23:00 - 24:00 | 0 | 0 | 0 | 0 |
| 19.07.2019 00:00 - 01:00 | 0 | 0 | 0 | 0 |
| 19.07.2019 01:00 - 02:00 | 0 | 0 | 0 | 0 |
| 19.07.2019 02:00 - 03:00 | 0 | 0 | 0 | 0 |
| 19.07.2019 03:00 - 04:00 | 0 | 0 | 0 | 0 |
| 19.07.2019 04:00 - 05:00 | 0 | 0 | 0 | 0 |
| 19.07.2019 05:00 - 06:00 | 0 | 0 | 0 | 0 |
| 19.07.2019 06:00 - 07:00 | 0 | 0 | 0 | 0 |
| 19.07.2019 07:00 - 08:00 | 0 | 0 | 0 | 0 |
| 19.07.2019 08:00 - 09:00 | 0 | 0 | 0 | 0 |
| 19.07.2019 09:00 - 10:00 | 0 | 0 | 0 | 0 |
| 19.07.2019 10:00 - 11:00 | 0 | 0 | 0 | 0 |
| 19.07.2019 11:00 - 12:00 | 0 | 0 | 0 | 0 |
| 19.07.2019 12:00 - 13:00 | 0 | 0 | 0 | 0 |
| 19.07.2019 13:00 - 14:00 | 0 | 0 | 0 | 0 |
| 19.07.2019 14:00 - 15:00 | 0 | 0 | 0 | 0 |
| 19.07.2019 15:00 - 16:00 | 0 | 0 | 0 | 0 |
| 19.07.2019 16:00 - 17:00 | 0 | 0 | 0 | 0 |
| 19.07.2019 17:00 - 18:00 | 0 | 0 | 0 | 0 |
| 19.07.2019 18:00 - 19:00 | 0 | 0 | 0 | 0 |
| 19.07.2019 19:00 - 20:00 | 0 | 0 | 0 | 0 |
| 19.07.2019 20:00 - 21:00 | 0 | 0 | 0 | 0 |
| 19.07.2019 21:00 - 22:00 | 0 | 0 | 0 | 0 |
| 19.07.2019 22:00 - 23:00 | 0 | 0 | 0 | 0 |
| 19.07.2019 23:00 - 24:00 | 0 | 0 | 0 | 0 |
| 20.07.2019 00:00 - 01:00 | 0 | 0 | 0 | 0 |
| 20.07.2019 01:00 - 02:00 | 0 | 0 | 0 | 0 |
| 20.07.2019 02:00 - 03:00 | 0 | 0 | 0 | 0 |
| 20.07.2019 03:00 - 04:00 | 0 | 0 | 0 | 0 |
| 20.07.2019 04:00 - 05:00 | 0 | 0 | 0 | 0 |
| 20.07.2019 05:00 - 06:00 | 0 | 0 | 0 | 0 |
| 20.07.2019 06:00 - 07:00 | 0 | 0 | 0 | 0 |
| 20.07.2019 07:00 - 08:00 | 0 | 0 | 0 | 0 |
| 20.07.2019 08:00 - 09:00 | 0 | 0 | 0 | 0 |
| 20.07.2019 09:00 - 10:00 | 0 | 0 | 0 | 0 |
| 20.07.2019 10:00 - 11:00 | 0 | 0 | 0 | 0 |
| 20.07.2019 11:00 - 12:00 | 0 | 0 | 0 | 0 |
| 20.07.2019 12:00 - 13:00 | 0 | 0 | 0 | 0 |
| 20.07.2019 13:00 - 14:00 | 0 | 0 | 0 | 0 |
| 20.07.2019 14:00 - 15:00 | 0 | 0 | 0 | 0 |
| 20.07.2019 15:00 - 16:00 | 0 | 0 | 0 | 0 |
| 20.07.2019 16:00 - 17:00 | 0 | 0 | 0 | 0 |
| 20.07.2019 17:00 - 18:00 | 0 | 0 | 0 | 0 |
| 20.07.2019 18:00 - 19:00 | 0 | 0 | 0 | 0 |
| 20.07.2019 19:00 - 20:00 | 0 | 0 | 0 | 0 |
| 20.07.2019 20:00 - 21:00 | 0 | 0 | 0 | 0 |
| 20.07.2019 21:00 - 22:00 | 0 | 0 | 0 | 0 |
| 20.07.2019 22:00 - 23:00 | 0 | 0 | 0 | 0 |
| 20.07.2019 23:00 - 24:00 | 0 | 0 | 0 | 0 |
| 21.07.2019 00:00 - 01:00 | 0 | 0 | 0 | 0 |
| 21.07.2019 01:00 - 02:00 | 0 | 0 | 0 | 0 |
| 21.07.2019 02:00 - 03:00 | 0 | 0 | 0 | 0 |
| 21.07.2019 03:00 - 04:00 | 0 | 0 | 0 | 0 |
| 21.07.2019 04:00 - 05:00 | 0 | 0 | 0 | 0 |
| 21.07.2019 05:00 - 06:00 | 0 | 0 | 0 | 0 |
| 21.07.2019 06:00 - 07:00 | 0 | 0 | 0 | 0 |
| 21.07.2019 07:00 - 08:00 | 0 | 0 | 0 | 0 |
| 21.07.2019 08:00 - 09:00 | 0 | 0 | 0 | 0 |
| 21.07.2019 09:00 - 10:00 | 0 | 0 | 0 | 0 |
| 21.07.2019 10:00 - 11:00 | 0 | 0 | 0 | 0 |
| 21.07.2019 11:00 - 12:00 | 0 | -200 | 0 | 0 |
| 21.07.2019 12:00 - 13:00 | 0 | -200 | 0 | 0 |
| 21.07.2019 13:00 - 14:00 | 0 | -200 | 0 | 0 |
| 21.07.2019 14:00 - 15:00 | 0 | -200 | 0 | 0 |
| 21.07.2019 15:00 - 16:00 | 0 | -200 | 0 | 0 |
| 21.07.2019 16:00 - 17:00 | 0 | -200 | 0 | 0 |
| 21.07.2019 17:00 - 18:00 | 0 | -200 | 0 | 0 |
| 21.07.2019 18:00 - 19:00 | 0 | -200 | 0 | 0 |
| 21.07.2019 19:00 - 20:00 | 0 | -200 | 0 | 0 |
| 21.07.2019 20:00 - 21:00 | 0 | -200 | 0 | 0 |
| 21.07.2019 21:00 - 22:00 | 0 | -200 | 0 | 0 |
| 21.07.2019 22:00 - 23:00 | 0 | -200 | 0 | 0 |
| 21.07.2019 23:00 - 24:00 | 0 | -200 | 0 | 0 |
| 22.07.2019 00:00 - 01:00 | 0 | -200 | 0 | 0 |
| 22.07.2019 01:00 - 02:00 | 0 | -200 | 0 | 0 |
| 22.07.2019 02:00 - 03:00 | 0 | -200 | 0 | 0 |
| 22.07.2019 03:00 - 04:00 | 0 | -200 | 0 | 0 |
| 22.07.2019 04:00 - 05:00 | 0 | -200 | 0 | 0 |
| 22.07.2019 05:00 - 06:00 | 0 | -200 | 0 | 0 |
| 22.07.2019 06:00 - 07:00 | 0 | 0 | 0 | 0 |
| 22.07.2019 07:00 - 08:00 | 0 | 0 | 0 | 0 |
| 22.07.2019 08:00 - 09:00 | 0 | 0 | 0 | 0 |
| 22.07.2019 09:00 - 10:00 | 0 | 0 | 0 | 0 |
| 22.07.2019 10:00 - 11:00 | 0 | 0 | 0 | 0 |
| 22.07.2019 11:00 - 12:00 | 0 | 0 | 0 | 0 |
| 22.07.2019 12:00 - 13:00 | 0 | 0 | 0 | 0 |
| 22.07.2019 13:00 - 14:00 | 0 | 0 | 0 | 0 |
| 22.07.2019 14:00 - 15:00 | 0 | 0 | 0 | 0 |
| 22.07.2019 15:00 - 16:00 | 0 | 0 | 0 | 0 |
| 22.07.2019 16:00 - 17:00 | 0 | 0 | 0 | 0 |
| 22.07.2019 17:00 - 18:00 | 0 | 0 | 0 | 0 |
| 22.07.2019 18:00 - 19:00 | 0 | 0 | 0 | 0 |
| 22.07.2019 19:00 - 20:00 | 0 | 0 | 0 | 0 |
| 22.07.2019 20:00 - 21:00 | 0 | 0 | 0 | 0 |
| 22.07.2019 21:00 - 22:00 | 0 | 0 | 0 | 0 |
| 22.07.2019 22:00 - 23:00 | 0 | 0 | 0 | 0 |
| 22.07.2019 23:00 - 24:00 | 0 | 0 | 0 | 0 |
| 23.07.2019 00:00 - 01:00 | 0 | 0 | 0 | 0 |
| 23.07.2019 01:00 - 02:00 | 0 | 0 | 0 | 0 |
| 23.07.2019 02:00 - 03:00 | 0 | 0 | 0 | 0 |
| 23.07.2019 03:00 - 04:00 | 0 | 0 | 0 | 0 |
| 23.07.2019 04:00 - 05:00 | 0 | 0 | 0 | 0 |
| 23.07.2019 05:00 - 06:00 | 0 | 0 | 0 | 0 |
| 23.07.2019 06:00 - 07:00 | 0 | 0 | 0 | 0 |
| 23.07.2019 07:00 - 08:00 | 0 | 0 | 0 | 0 |
| 23.07.2019 08:00 - 09:00 | 0 | 0 | 0 | 0 |
| 23.07.2019 09:00 - 10:00 | 0 | 0 | 0 | 0 |
| 23.07.2019 10:00 - 11:00 | 0 | 0 | 0 | 0 |
| 23.07.2019 11:00 - 12:00 | 0 | 0 | 0 | 0 |
| 23.07.2019 12:00 - 13:00 | 0 | 0 | 0 | 0 |
| 23.07.2019 13:00 - 14:00 | 0 | 0 | 0 | 0 |
| 23.07.2019 14:00 - 15:00 | 0 | 0 | 0 | 0 |
| 23.07.2019 15:00 - 16:00 | 0 | 0 | 0 | 0 |
| 23.07.2019 16:00 - 17:00 | 0 | 0 | 0 | 0 |
| 23.07.2019 17:00 - 18:00 | 0 | 0 | 0 | 0 |
| 23.07.2019 18:00 - 19:00 | 0 | 0 | 0 | 0 |
| 23.07.2019 19:00 - 20:00 | 0 | 0 | 0 | 0 |
| 23.07.2019 20:00 - 21:00 | 0 | 0 | 0 | 0 |
| 23.07.2019 21:00 - 22:00 | 0 | 0 | 0 | 0 |
| 23.07.2019 22:00 - 23:00 | 0 | 0 | 0 | 0 |
| 23.07.2019 23:00 - 24:00 | 0 | 0 | 0 | 0 |
| 24.07.2019 00:00 - 01:00 | 0 | 0 | 0 | 0 |
| 24.07.2019 01:00 - 02:00 | 0 | 0 | 0 | 0 |
| 24.07.2019 02:00 - 03:00 | 0 | 0 | 0 | 0 |
| 24.07.2019 03:00 - 04:00 | 0 | 0 | 0 | 0 |
| 24.07.2019 04:00 - 05:00 | 0 | 0 | 0 | 0 |
| 24.07.2019 05:00 - 06:00 | 0 | 0 | 0 | 0 |
| 24.07.2019 06:00 - 07:00 | 0 | 0 | 0 | 0 |
| 24.07.2019 07:00 - 08:00 | 0 | 0 | 0 | 0 |
| 24.07.2019 08:00 - 09:00 | 0 | 0 | 0 | 0 |
| 24.07.2019 09:00 - 10:00 | 0 | 0 | 0 | 0 |
| 24.07.2019 10:00 - 11:00 | 0 | 0 | 0 | 0 |
| 24.07.2019 11:00 - 12:00 | 0 | 0 | 0 | 0 |
| 24.07.2019 12:00 - 13:00 | 0 | 0 | 0 | 0 |
| 24.07.2019 13:00 - 14:00 | 0 | 0 | 0 | 0 |
| 24.07.2019 14:00 - 15:00 | 0 | 0 | 0 | 0 |
| 24.07.2019 15:00 - 16:00 | 0 | 0 | 0 | 0 |
| 24.07.2019 16:00 - 17:00 | 0 | 0 | 0 | 0 |
| 24.07.2019 17:00 - 18:00 | 0 | 0 | 0 | 0 |
| 24.07.2019 18:00 - 19:00 | 0 | 0 | 0 | 0 |
| 24.07.2019 19:00 - 20:00 | 0 | 0 | 0 | 0 |
| 24.07.2019 20:00 - 21:00 | 0 | 0 | 0 | 0 |
| 24.07.2019 21:00 - 22:00 | 0 | 0 | 0 | 0 |
| 24.07.2019 22:00 - 23:00 | 0 | 0 | 0 | 0 |
| 24.07.2019 23:00 - 24:00 | 0 | 0 | 0 | 0 |
| 25.07.2019 00:00 - 01:00 | 0 | 0 | 0 | 0 |
| 25.07.2019 01:00 - 02:00 | 0 | 0 | 0 | 0 |
| 25.07.2019 02:00 - 03:00 | 0 | 0 | 0 | 0 |
| 25.07.2019 03:00 - 04:00 | 0 | 0 | 0 | 0 |
| 25.07.2019 04:00 - 05:00 | 0 | 0 | 0 | 0 |
| 25.07.2019 05:00 - 06:00 | 0 | 0 | 0 | 0 |
| 25.07.2019 06:00 - 07:00 | 0 | 0 | 0 | 0 |
| 25.07.2019 07:00 - 08:00 | 0 | 0 | 0 | 0 |
| 25.07.2019 08:00 - 09:00 | 0 | 0 | 0 | 0 |
| 25.07.2019 09:00 - 10:00 | 0 | 0 | 0 | 0 |
| 25.07.2019 10:00 - 11:00 | 0 | 0 | 0 | 0 |
| 25.07.2019 11:00 - 12:00 | 0 | 0 | 0 | 0 |
| 25.07.2019 12:00 - 13:00 | 0 | 0 | 0 | 0 |
| 25.07.2019 13:00 - 14:00 | 0 | 0 | 0 | 0 |
| 25.07.2019 14:00 - 15:00 | 0 | 0 | 0 | 0 |
| 25.07.2019 15:00 - 16:00 | 0 | 0 | 0 | 0 |
| 25.07.2019 16:00 - 17:00 | 0 | 0 | 0 | 0 |
| 25.07.2019 17:00 - 18:00 | 0 | 0 | 0 | 0 |
| 25.07.2019 18:00 - 19:00 | 0 | 0 | 0 | 0 |
| 25.07.2019 19:00 - 20:00 | 0 | 0 | 0 | 0 |
| 25.07.2019 20:00 - 21:00 | 0 | 0 | 0 | 0 |
| 25.07.2019 21:00 - 22:00 | 0 | 0 | 0 | 0 |
| 25.07.2019 22:00 - 23:00 | 0 | 0 | 0 | 0 |
| 25.07.2019 23:00 - 24:00 | 0 | 0 | 0 | 0 |
| 26.07.2019 00:00 - 01:00 | 0 | 0 | 0 | 0 |
| 26.07.2019 01:00 - 02:00 | 0 | 0 | 0 | 0 |
| 26.07.2019 02:00 - 03:00 | 0 | 0 | 0 | 0 |
| 26.07.2019 03:00 - 04:00 | 0 | 0 | 0 | 0 |
| 26.07.2019 04:00 - 05:00 | 0 | 0 | 0 | 0 |
| 26.07.2019 05:00 - 06:00 | 0 | 0 | 0 | 0 |
| 26.07.2019 06:00 - 07:00 | 0 | 0 | 0 | 0 |
| 26.07.2019 07:00 - 08:00 | 0 | 0 | 0 | 0 |
| 26.07.2019 08:00 - 09:00 | 0 | 0 | 0 | 0 |
| 26.07.2019 09:00 - 10:00 | 0 | 0 | 0 | 0 |
| 26.07.2019 10:00 - 11:00 | 0 | 0 | 0 | 0 |
| 26.07.2019 11:00 - 12:00 | 0 | 0 | 0 | 0 |
| 26.07.2019 12:00 - 13:00 | 0 | 0 | 0 | 0 |
| 26.07.2019 13:00 - 14:00 | 0 | 0 | 0 | 0 |
| 26.07.2019 14:00 - 15:00 | 0 | 0 | 0 | 0 |
| 26.07.2019 15:00 - 16:00 | 0 | 0 | 0 | 0 |
| 26.07.2019 16:00 - 17:00 | 0 | 0 | 0 | 0 |
| 26.07.2019 17:00 - 18:00 | 0 | 0 | 0 | 0 |
| 26.07.2019 18:00 - 19:00 | 0 | 0 | 0 | 0 |
| 26.07.2019 19:00 - 20:00 | 0 | 0 | 0 | 0 |
| 26.07.2019 20:00 - 21:00 | 0 | 0 | 0 | 0 |
| 26.07.2019 21:00 - 22:00 | 0 | 0 | 0 | 0 |
| 26.07.2019 22:00 - 23:00 | 0 | 0 | 0 | 0 |
| 26.07.2019 23:00 - 24:00 | 0 | 0 | 0 | 0 |
| 27.07.2019 00:00 - 01:00 | 0 | 0 | 0 | 0 |
| 27.07.2019 01:00 - 02:00 | 0 | 0 | 0 | 0 |
| 27.07.2019 02:00 - 03:00 | 0 | 0 | 0 | 0 |
| 27.07.2019 03:00 - 04:00 | 0 | 0 | 0 | 0 |
| 27.07.2019 04:00 - 05:00 | 0 | 0 | 0 | 0 |
| 27.07.2019 05:00 - 06:00 | 0 | 0 | 0 | 0 |
| 27.07.2019 06:00 - 07:00 | 0 | 0 | 0 | 0 |
| 27.07.2019 07:00 - 08:00 | 0 | 0 | 0 | 0 |
| 27.07.2019 08:00 - 09:00 | 0 | 0 | 0 | 0 |
| 27.07.2019 09:00 - 10:00 | 0 | 0 | 0 | 0 |
| 27.07.2019 10:00 - 11:00 | 0 | 0 | 0 | 0 |
| 27.07.2019 11:00 - 12:00 | 0 | 0 | 0 | 0 |
| 27.07.2019 12:00 - 13:00 | 0 | 0 | 0 | 0 |
| 27.07.2019 13:00 - 14:00 | 0 | 0 | 0 | 0 |
| 27.07.2019 14:00 - 15:00 | 0 | 0 | 0 | 0 |
| 27.07.2019 15:00 - 16:00 | 0 | 0 | 0 | 0 |
| 27.07.2019 16:00 - 17:00 | 0 | 0 | 0 | 0 |
| 27.07.2019 17:00 - 18:00 | 0 | 0 | 0 | 0 |
| 27.07.2019 18:00 - 19:00 | 0 | 0 | 0 | 0 |
| 27.07.2019 19:00 - 20:00 | 0 | 0 | 0 | 0 |
| 27.07.2019 20:00 - 21:00 | 0 | 0 | 0 | 0 |
| 27.07.2019 21:00 - 22:00 | 0 | 0 | 0 | 0 |
| 27.07.2019 22:00 - 23:00 | 0 | 0 | 0 | 0 |
| 27.07.2019 23:00 - 24:00 | 0 | 0 | 0 | 0 |
| 28.07.2019 00:00 - 01:00 | 0 | 0 | 0 | 0 |
| 28.07.2019 01:00 - 02:00 | 0 | 0 | 0 | 0 |
| 28.07.2019 02:00 - 03:00 | 0 | 0 | 0 | 0 |
| 28.07.2019 03:00 - 04:00 | 0 | 0 | 0 | 0 |
| 28.07.2019 04:00 - 05:00 | 0 | 0 | 0 | 0 |
| 28.07.2019 05:00 - 06:00 | 0 | 0 | 0 | 0 |
| 28.07.2019 06:00 - 07:00 | 0 | 0 | 0 | 0 |
| 28.07.2019 07:00 - 08:00 | 0 | 0 | 0 | 0 |
| 28.07.2019 08:00 - 09:00 | 0 | 0 | 0 | 0 |
| 28.07.2019 09:00 - 10:00 | 0 | 0 | 0 | 0 |
| 28.07.2019 10:00 - 11:00 | 0 | 0 | 0 | 0 |
| 28.07.2019 11:00 - 12:00 | 0 | 0 | 0 | 0 |
| 28.07.2019 12:00 - 13:00 | 0 | 0 | 0 | 0 |
| 28.07.2019 13:00 - 14:00 | 0 | 0 | 0 | 0 |
| 28.07.2019 14:00 - 15:00 | 0 | -400 | 0 | 0 |
| 28.07.2019 15:00 - 16:00 | 0 | -400 | 0 | 0 |
| 28.07.2019 16:00 - 17:00 | 0 | -400 | 0 | 0 |
| 28.07.2019 17:00 - 18:00 | 0 | -400 | 0 | 0 |
| 28.07.2019 18:00 - 19:00 | 0 | -400 | 0 | 0 |
| 28.07.2019 19:00 - 20:00 | 0 | -400 | 0 | 0 |
| 28.07.2019 20:00 - 21:00 | 0 | -400 | 0 | 0 |
| 28.07.2019 21:00 - 22:00 | 0 | -400 | 0 | 0 |
| 28.07.2019 22:00 - 23:00 | 0 | -400 | 0 | 0 |
| 28.07.2019 23:00 - 24:00 | 0 | -400 | 0 | 0 |
| 29.07.2019 00:00 - 01:00 | 0 | -400 | 0 | 0 |
| 29.07.2019 01:00 - 02:00 | 0 | -400 | 0 | 0 |
| 29.07.2019 02:00 - 03:00 | 0 | -400 | 0 | 0 |
| 29.07.2019 03:00 - 04:00 | 0 | -400 | 0 | 0 |
| 29.07.2019 04:00 - 05:00 | 0 | -400 | 0 | 0 |
| 29.07.2019 05:00 - 06:00 | 0 | -400 | 0 | 0 |
| 29.07.2019 06:00 - 07:00 | 0 | 0 | 0 | 0 |
| 29.07.2019 07:00 - 08:00 | 0 | 0 | 0 | 0 |
| 29.07.2019 08:00 - 09:00 | 0 | 0 | 0 | 0 |
| 29.07.2019 09:00 - 10:00 | 0 | 0 | 0 | 0 |
| 29.07.2019 10:00 - 11:00 | 0 | 0 | 0 | 0 |
| 29.07.2019 11:00 - 12:00 | 0 | 0 | 0 | 0 |
| 29.07.2019 12:00 - 13:00 | 0 | 0 | 0 | 0 |
| 29.07.2019 13:00 - 14:00 | 0 | 0 | 0 | 0 |
| 29.07.2019 14:00 - 15:00 | 0 | 0 | 0 | 0 |
| 29.07.2019 15:00 - 16:00 | 0 | 0 | 0 | 0 |
| 29.07.2019 16:00 - 17:00 | 0 | 0 | 0 | 0 |
| 29.07.2019 17:00 - 18:00 | 0 | 0 | 0 | 0 |
| 29.07.2019 18:00 - 19:00 | 0 | 0 | 0 | 0 |
| 29.07.2019 19:00 - 20:00 | 0 | -400 | 0 | 0 |
| 29.07.2019 20:00 - 21:00 | 0 | -400 | 0 | 0 |
| 29.07.2019 21:00 - 22:00 | 0 | -400 | 0 | 0 |
| 29.07.2019 22:00 - 23:00 | 0 | -400 | 0 | 0 |
| 29.07.2019 23:00 - 24:00 | 0 | -400 | 0 | 0 |
| 30.07.2019 00:00 - 01:00 | 0 | -400 | 0 | 0 |
| 30.07.2019 01:00 - 02:00 | 0 | -400 | 0 | 0 |
| 30.07.2019 02:00 - 03:00 | 0 | -400 | 0 | 0 |
| 30.07.2019 03:00 - 04:00 | 0 | -400 | 0 | 0 |
| 30.07.2019 04:00 - 05:00 | 0 | -400 | 0 | 0 |
| 30.07.2019 05:00 - 06:00 | 0 | -400 | 0 | 0 |
| 30.07.2019 06:00 - 07:00 | 0 | 0 | 0 | 0 |
| 30.07.2019 07:00 - 08:00 | 0 | 0 | 0 | 0 |
| 30.07.2019 08:00 - 09:00 | 0 | 0 | 0 | 0 |
| 30.07.2019 09:00 - 10:00 | 0 | 0 | 0 | 0 |
| 30.07.2019 10:00 - 11:00 | 0 | 0 | 0 | 0 |
| 30.07.2019 11:00 - 12:00 | 0 | 0 | 0 | 0 |
| 30.07.2019 12:00 - 13:00 | 0 | 0 | 0 | 0 |
| 30.07.2019 13:00 - 14:00 | 0 | 0 | 0 | 0 |
| 30.07.2019 14:00 - 15:00 | 0 | 0 | 0 | 0 |
| 30.07.2019 15:00 - 16:00 | 0 | 0 | 0 | 0 |
| 30.07.2019 16:00 - 17:00 | 0 | 0 | 0 | 0 |
| 30.07.2019 17:00 - 18:00 | 0 | 0 | 0 | 0 |
| 30.07.2019 18:00 - 19:00 | 0 | 0 | 0 | 0 |
| 30.07.2019 19:00 - 20:00 | 0 | 0 | 0 | 0 |
| 30.07.2019 20:00 - 21:00 | 0 | 0 | 0 | 0 |
| 30.07.2019 21:00 - 22:00 | 0 | 0 | 0 | 0 |
| 30.07.2019 22:00 - 23:00 | 0 | 0 | 0 | 0 |
| 30.07.2019 23:00 - 24:00 | 0 | 0 | 0 | 0 |
| 31.07.2019 00:00 - 01:00 | 0 | 0 | 0 | 0 |
| 31.07.2019 01:00 - 02:00 | 0 | 0 | 0 | 0 |
| 31.07.2019 02:00 - 03:00 | 0 | 0 | 0 | 0 |
| 31.07.2019 03:00 - 04:00 | 0 | 0 | 0 | 0 |
| 31.07.2019 04:00 - 05:00 | 0 | 0 | 0 | 0 |
| 31.07.2019 05:00 - 06:00 | 0 | 0 | 0 | 0 |
| 31.07.2019 06:00 - 07:00 | 0 | 0 | 0 | 0 |
| 31.07.2019 07:00 - 08:00 | 0 | 0 | 0 | 0 |
| 31.07.2019 08:00 - 09:00 | 0 | 0 | 0 | 0 |
| 31.07.2019 09:00 - 10:00 | 0 | 0 | 0 | 0 |
| 31.07.2019 10:00 - 11:00 | 0 | 0 | 0 | 0 |
| 31.07.2019 11:00 - 12:00 | 0 | 0 | 0 | 0 |
| 31.07.2019 12:00 - 13:00 | 0 | 0 | 0 | 0 |
| 31.07.2019 13:00 - 14:00 | 0 | 0 | 0 | 0 |
| 31.07.2019 14:00 - 15:00 | 0 | 0 | 0 | 0 |
| 31.07.2019 15:00 - 16:00 | 0 | 0 | 0 | 0 |
| 31.07.2019 16:00 - 17:00 | 0 | 0 | 0 | 0 |
| 31.07.2019 17:00 - 18:00 | 0 | 0 | 0 | 0 |
| 31.07.2019 18:00 - 19:00 | 0 | 0 | 0 | 0 |
| 31.07.2019 19:00 - 20:00 | 0 | 0 | 0 | 0 |
| 31.07.2019 20:00 - 21:00 | 0 | 0 | 0 | 0 |
| 31.07.2019 21:00 - 22:00 | 0 | 0 | 0 | 0 |
| 31.07.2019 22:00 - 23:00 | 0 | 0 | 0 | 0 |
| 31.07.2019 23:00 - 24:00 | 0 | 0 | 0 | 0 |
| 01.08.2019 00:00 - 01:00 | 0 | 0 | 0 | 0 |
| 01.08.2019 01:00 - 02:00 | 0 | 0 | 0 | 0 |
| 01.08.2019 02:00 - 03:00 | 0 | 0 | 0 | 0 |
| 01.08.2019 03:00 - 04:00 | 0 | 0 | 0 | 0 |
| 01.08.2019 04:00 - 05:00 | 0 | 0 | 0 | 0 |
| 01.08.2019 05:00 - 06:00 | 0 | 0 | 0 | 0 |